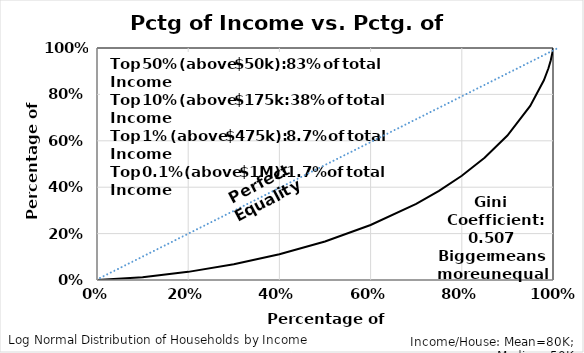
| Category | %$Up |
|---|---|
| 0.0 | 0 |
| 0.1 | 0.012 |
| 0.2 | 0.035 |
| 0.3 | 0.068 |
| 0.4 | 0.111 |
| 0.5 | 0.166 |
| 0.6 | 0.237 |
| 0.7 | 0.328 |
| 0.75 | 0.384 |
| 0.8 | 0.449 |
| 0.85 | 0.527 |
| 0.9 | 0.622 |
| 0.95 | 0.75 |
| 0.98 | 0.861 |
| 0.99 | 0.913 |
| 0.995 | 0.946 |
| 0.999 | 0.983 |
| 0.9995 | 0.99 |
| 0.9999 | 0.997 |